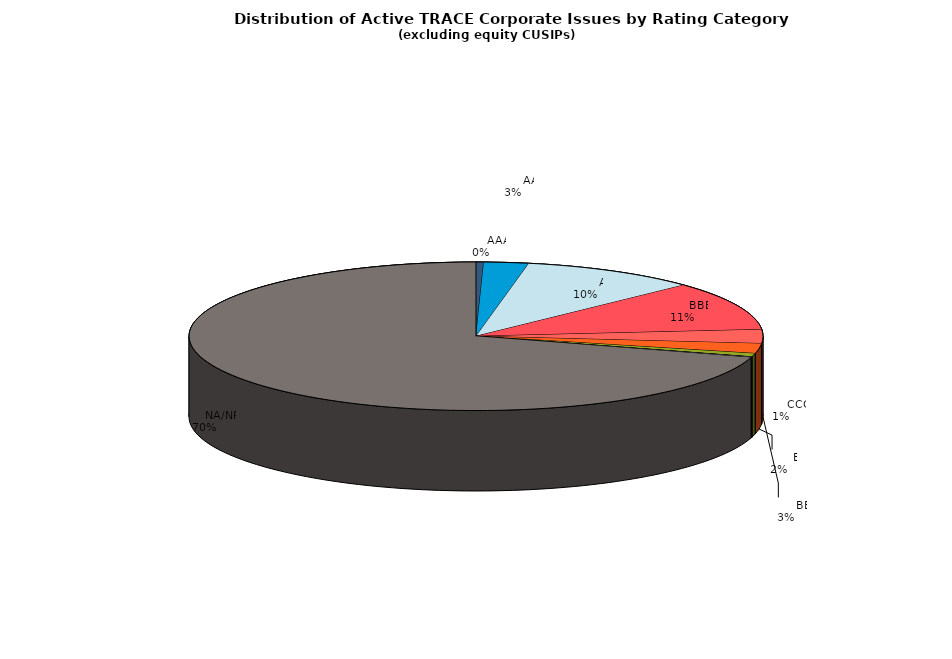
| Category | Series 0 |
|---|---|
|         AAA | 475 |
|         AA | 2782 |
|         A | 10959 |
|         BBB | 11738 |
|         BB | 3331 |
|         B | 2374 |
|         CCC | 804 |
|         CC | 52 |
|         C | 18 |
|         D | 100 |
|         NA/NR | 77581 |